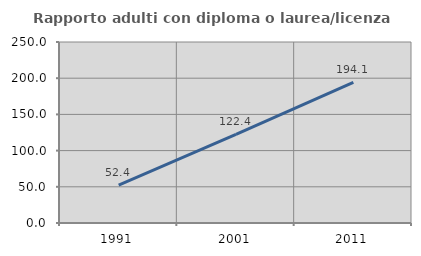
| Category | Rapporto adulti con diploma o laurea/licenza media  |
|---|---|
| 1991.0 | 52.367 |
| 2001.0 | 122.436 |
| 2011.0 | 194.118 |